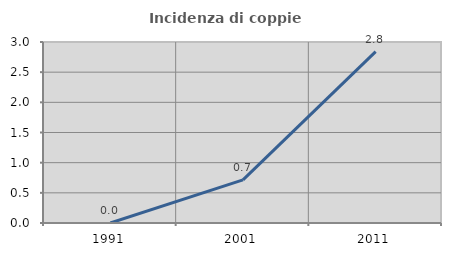
| Category | Incidenza di coppie miste |
|---|---|
| 1991.0 | 0 |
| 2001.0 | 0.714 |
| 2011.0 | 2.841 |